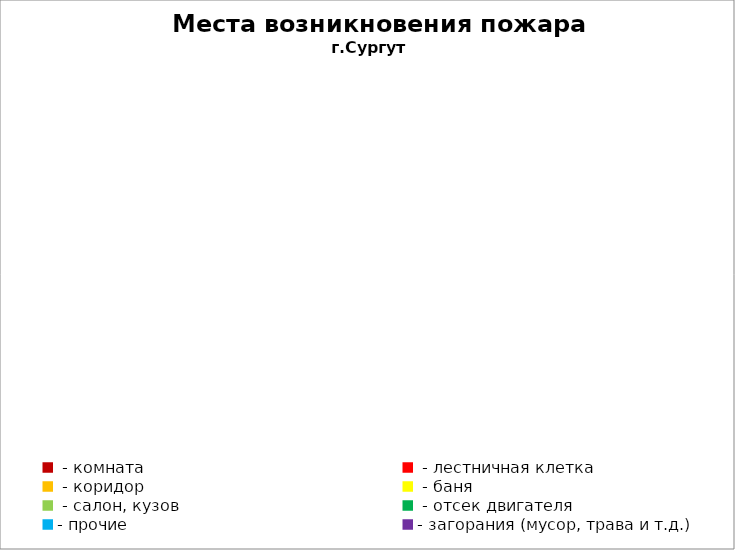
| Category | Места возникновения пожара |
|---|---|
|  - комната | 59 |
|  - лестничная клетка | 27 |
|  - коридор | 11 |
|  - баня | 28 |
|  - салон, кузов | 14 |
|  - отсек двигателя | 40 |
| - прочие | 159 |
| - загорания (мусор, трава и т.д.)  | 178 |